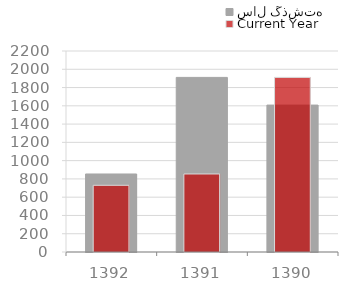
| Category | سال گذشته |
|---|---|
| 1392.0 | 854 |
| 1391.0 | 1911 |
| 1390.0 | 1608 |